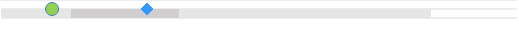
| Category | left | mid start | mid end | right |
|---|---|---|---|---|
| 0 | 0 | 0.163 | 0.252 | 0.586 |